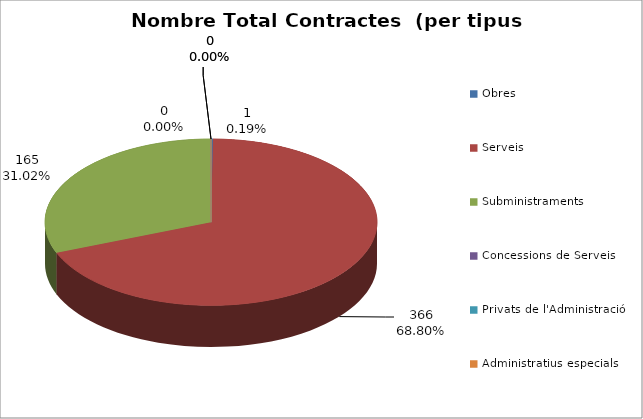
| Category | Nombre Total Contractes |
|---|---|
| Obres | 1 |
| Serveis | 366 |
| Subministraments | 165 |
| Concessions de Serveis | 0 |
| Privats de l'Administració | 0 |
| Administratius especials | 0 |